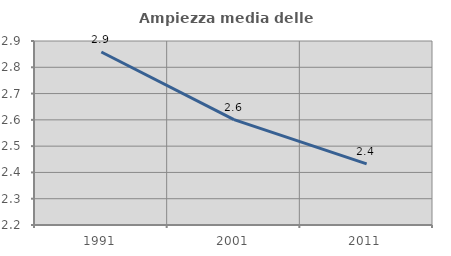
| Category | Ampiezza media delle famiglie |
|---|---|
| 1991.0 | 2.858 |
| 2001.0 | 2.601 |
| 2011.0 | 2.432 |